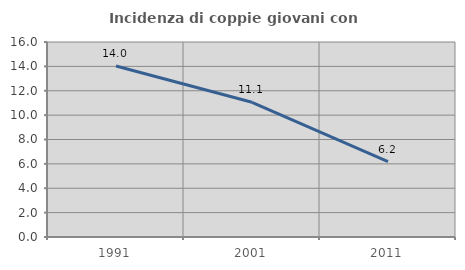
| Category | Incidenza di coppie giovani con figli |
|---|---|
| 1991.0 | 14.034 |
| 2001.0 | 11.054 |
| 2011.0 | 6.182 |